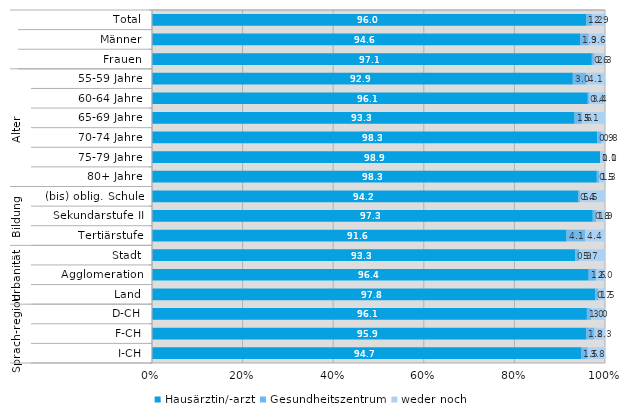
| Category | Hausärztin/-arzt | Gesundheitszentrum | weder noch |
|---|---|---|---|
| 0 | 96 | 1.2 | 2.9 |
| 1 | 94.6 | 1.9 | 3.6 |
| 2 | 97.1 | 0.6 | 2.3 |
| 3 | 92.9 | 3 | 4.1 |
| 4 | 96.1 | 0.4 | 3.4 |
| 5 | 93.3 | 1.6 | 5.1 |
| 6 | 98.3 | 0.9 | 0.8 |
| 7 | 98.9 | 0.1 | 1 |
| 8 | 98.3 | 0.5 | 1.3 |
| 9 | 94.2 | 0.4 | 5.5 |
| 10 | 97.3 | 0.8 | 1.9 |
| 11 | 91.6 | 4.1 | 4.4 |
| 12 | 93.3 | 0.9 | 5.7 |
| 13 | 96.4 | 1.6 | 2 |
| 14 | 97.8 | 0.7 | 1.5 |
| 15 | 96.1 | 1 | 3 |
| 16 | 95.9 | 1.8 | 2.3 |
| 17 | 94.7 | 1.5 | 3.8 |